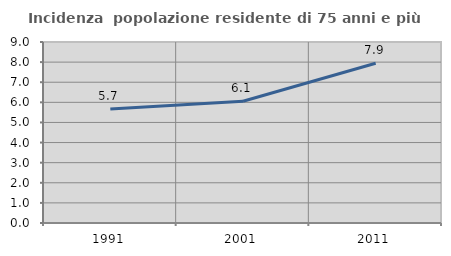
| Category | Incidenza  popolazione residente di 75 anni e più |
|---|---|
| 1991.0 | 5.673 |
| 2001.0 | 6.054 |
| 2011.0 | 7.942 |